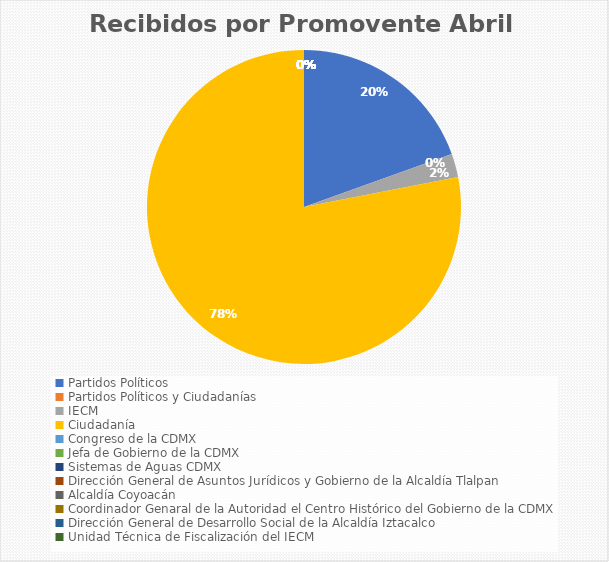
| Category | Recibidos por Promovente Abril |
|---|---|
| Partidos Políticos | 8 |
| Partidos Políticos y Ciudadanías | 0 |
| IECM | 1 |
| Ciudadanía  | 32 |
| Congreso de la CDMX | 0 |
| Jefa de Gobierno de la CDMX | 0 |
| Sistemas de Aguas CDMX | 0 |
| Dirección General de Asuntos Jurídicos y Gobierno de la Alcaldía Tlalpan | 0 |
| Alcaldía Coyoacán | 0 |
| Coordinador Genaral de la Autoridad el Centro Histórico del Gobierno de la CDMX | 0 |
| Dirección General de Desarrollo Social de la Alcaldía Iztacalco | 0 |
| Unidad Técnica de Fiscalización del IECM | 0 |